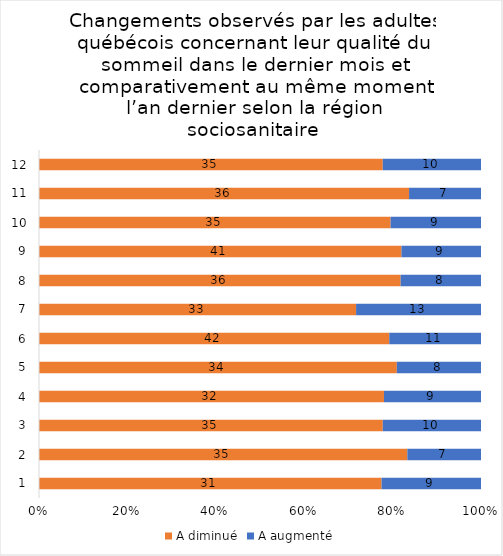
| Category | A diminué | A augmenté |
|---|---|---|
| 0 | 31 | 9 |
| 1 | 35 | 7 |
| 2 | 35 | 10 |
| 3 | 32 | 9 |
| 4 | 34 | 8 |
| 5 | 42 | 11 |
| 6 | 33 | 13 |
| 7 | 36 | 8 |
| 8 | 41 | 9 |
| 9 | 35 | 9 |
| 10 | 36 | 7 |
| 11 | 35 | 10 |